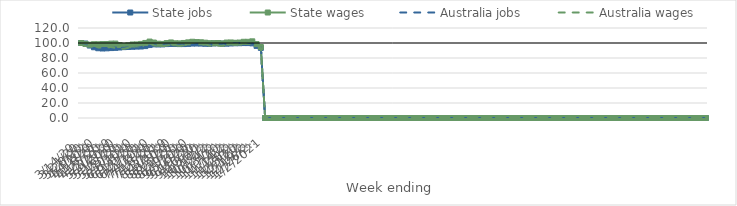
| Category | State jobs | State wages | Australia jobs | Australia wages |
|---|---|---|---|---|
| 14/03/2020 | 100 | 100 | 100 | 100 |
| 21/03/2020 | 99.265 | 98.813 | 99.218 | 99.669 |
| 28/03/2020 | 96.604 | 97.752 | 96.159 | 98.38 |
| 04/04/2020 | 94.316 | 98.366 | 93.511 | 96.663 |
| 11/04/2020 | 93.008 | 98.31 | 91.845 | 94.08 |
| 18/04/2020 | 92.692 | 98.59 | 91.454 | 93.993 |
| 25/04/2020 | 92.889 | 98.645 | 91.82 | 94.131 |
| 02/05/2020 | 93.235 | 99.184 | 92.24 | 94.625 |
| 09/05/2020 | 93.513 | 99.244 | 92.814 | 93.438 |
| 16/05/2020 | 93.994 | 97.283 | 93.355 | 92.628 |
| 23/05/2020 | 94.481 | 96.372 | 93.675 | 92.257 |
| 30/05/2020 | 94.7 | 96.966 | 94.182 | 93.555 |
| 06/06/2020 | 94.942 | 98.001 | 95.129 | 95.487 |
| 13/06/2020 | 95.225 | 98.093 | 95.64 | 96.179 |
| 20/06/2020 | 95.307 | 98.758 | 95.803 | 97.167 |
| 27/06/2020 | 95.892 | 100.068 | 95.768 | 97.377 |
| 04/07/2020 | 97.266 | 101.911 | 97.026 | 99.465 |
| 11/07/2020 | 98.208 | 100.602 | 97.722 | 96.839 |
| 18/07/2020 | 98.042 | 99.083 | 97.64 | 96.355 |
| 25/07/2020 | 98.112 | 98.789 | 97.768 | 96.035 |
| 01/08/2020 | 98.55 | 99.911 | 97.912 | 96.762 |
| 08/08/2020 | 98.725 | 100.747 | 97.848 | 97.159 |
| 15/08/2020 | 98.635 | 99.61 | 97.715 | 96.636 |
| 22/08/2020 | 98.526 | 99.482 | 97.726 | 96.439 |
| 29/08/2020 | 98.578 | 100.046 | 97.792 | 96.622 |
| 05/09/2020 | 98.812 | 100.843 | 97.988 | 99.323 |
| 12/09/2020 | 99.268 | 101.662 | 98.415 | 100.272 |
| 19/09/2020 | 99.293 | 101.24 | 98.579 | 101.043 |
| 26/09/2020 | 99.238 | 100.969 | 98.452 | 100.421 |
| 03/10/2020 | 98.947 | 100.425 | 97.813 | 98.297 |
| 10/10/2020 | 98.857 | 99.748 | 97.688 | 96.578 |
| 17/10/2020 | 99.434 | 99.686 | 98.252 | 97.02 |
| 24/10/2020 | 99.728 | 99.959 | 98.419 | 96.422 |
| 31/10/2020 | 99.105 | 99.397 | 98.499 | 96.422 |
| 07/11/2020 | 99.086 | 100.587 | 98.826 | 97.695 |
| 14/11/2020 | 99.399 | 100.714 | 99.425 | 98.506 |
| 21/11/2020 | 99.637 | 100.292 | 99.648 | 98.519 |
| 28/11/2020 | 99.729 | 100.598 | 99.873 | 99.566 |
| 05/12/2020 | 99.91 | 101.615 | 100.204 | 100.773 |
| 12/12/2020 | 99.882 | 101.58 | 100.228 | 101.122 |
| 19/12/2020 | 99.52 | 102.224 | 99.39 | 101.653 |
| 26/12/2020 | 96.157 | 98.51 | 96.352 | 97.474 |
| 02/01/2021 | 93.492 | 94.631 | 93.927 | 93.755 |